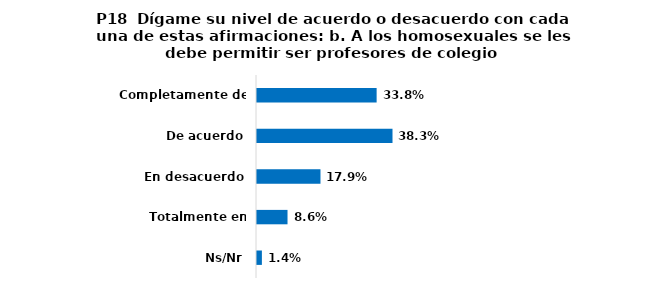
| Category | Series 0 |
|---|---|
| Completamente de acuerdo | 0.338 |
| De acuerdo | 0.383 |
| En desacuerdo | 0.179 |
| Totalmente en desacuerdo | 0.086 |
| Ns/Nr | 0.014 |